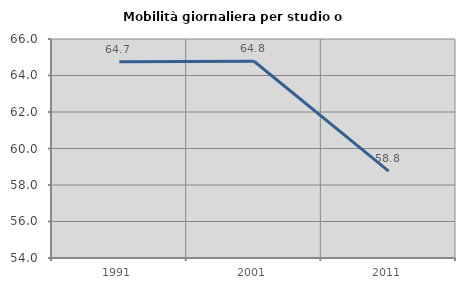
| Category | Mobilità giornaliera per studio o lavoro |
|---|---|
| 1991.0 | 64.748 |
| 2001.0 | 64.783 |
| 2011.0 | 58.76 |